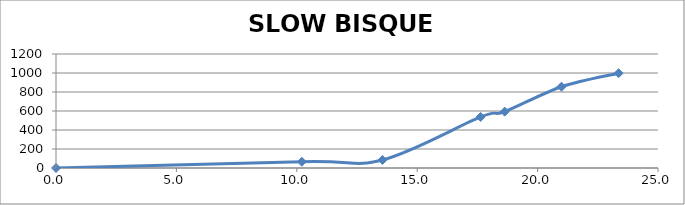
| Category | SLOW BISQUE CHART |
|---|---|
| 0.0 | 0 |
| 10.208 | 65.556 |
| 13.558 | 85 |
| 17.633 | 537.778 |
| 18.633 | 593.333 |
| 20.993002 | 855.556 |
| 23.36336866666666 | 997.778 |